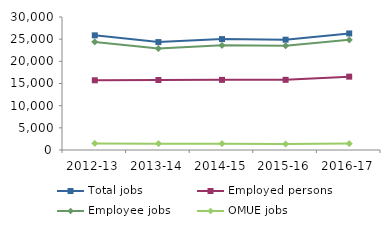
| Category | Total jobs | Employed persons | Employee jobs | OMUE jobs |
|---|---|---|---|---|
| 2012-13 | 25862 | 15725 | 24373 | 1490 |
| 2013-14 | 24343 | 15784 | 22908 | 1434 |
| 2014-15 | 25017 | 15819 | 23600 | 1415 |
| 2015-16 | 24879 | 15828 | 23512 | 1365 |
| 2016-17 | 26290 | 16545 | 24842 | 1448 |